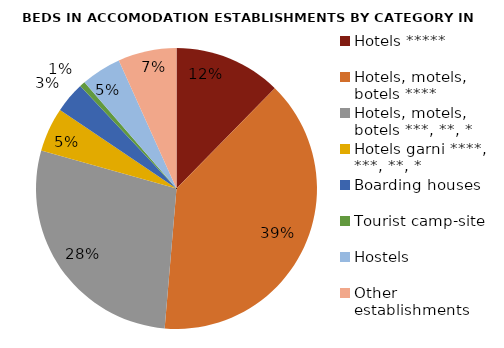
| Category | Series 0 |
|---|---|
| Hotels ***** | 12599 |
| Hotels, motels, botels **** | 39835 |
| Hotels, motels, botels ***, **, * | 28594 |
| Hotels garni ****, ***, **, * | 5208 |
| Boarding houses | 3621 |
| Tourist camp-site | 654 |
| Hostels | 4733 |
| Other establishments | 6874 |